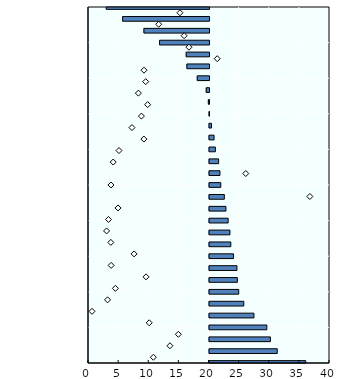
| Category | Real |
|---|---|
| Armenia | 15.979 |
| Georgia | 11.244 |
| Namibia | 10.11 |
| Romania | 9.521 |
| Zambia | 7.377 |
| Peru | 5.691 |
| Croatia | 4.85 |
| Dominican Republic | 4.628 |
| Uruguay | 4.555 |
| Bulgaria | 3.989 |
| North Macedonia | 3.537 |
| India | 3.393 |
| Guyana | 3.099 |
| Macau (China) | 2.728 |
| Ghana | 2.463 |
| Maldives | 1.873 |
| Malawi | 1.73 |
| Morocco | 1.514 |
| Hong Kong (China) | 0.977 |
| Kosovo* | 0.761 |
| Papua New Guinea | 0.331 |
| Serbia | 0.002 |
| Albania | -0.107 |
| Kazakhstan | -0.461 |
| Kenya | -1.949 |
| Lesotho | -3.667 |
| Brazil | -3.782 |
| Angola | -8.203 |
| Nigeria | -10.799 |
| Suriname | -14.338 |
| Egypt | -17.051 |